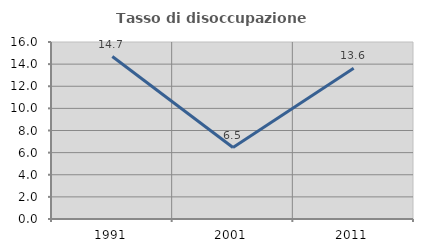
| Category | Tasso di disoccupazione giovanile  |
|---|---|
| 1991.0 | 14.684 |
| 2001.0 | 6.461 |
| 2011.0 | 13.636 |